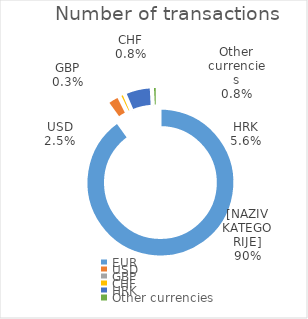
| Category | Number of transactions |
|---|---|
| EUR | 6117513 |
| USD | 168743 |
| GBP | 18374 |
| CHF | 51019 |
| HRK | 381741 |
| Other currencies | 55419 |